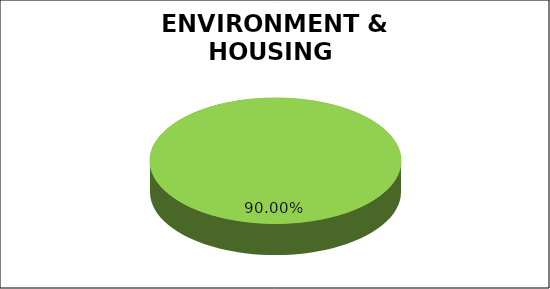
| Category | Green | Amber | Red |
|---|---|---|---|
| Q3 | 0.9 | 0.067 | 0.033 |